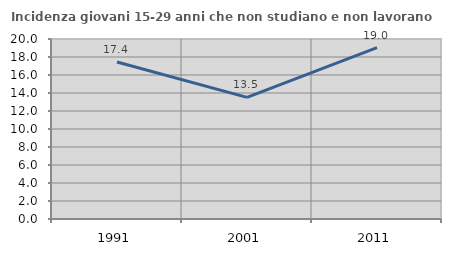
| Category | Incidenza giovani 15-29 anni che non studiano e non lavorano  |
|---|---|
| 1991.0 | 17.448 |
| 2001.0 | 13.514 |
| 2011.0 | 19.048 |